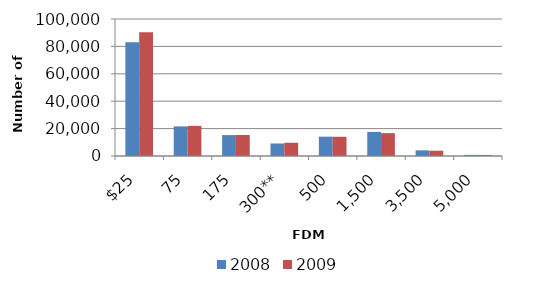
| Category | 2008 | 2009 |
|---|---|---|
| $25 | 82946 | 90256 |
| 75 | 21616 | 21958 |
| 175 | 15251 | 15346 |
| 300** | 9127 | 9666 |
| 500 | 14109 | 14027 |
| 1,500 | 17557 | 16682 |
| 3,500 | 4117 | 3839 |
| 5,000 | 801 | 772 |